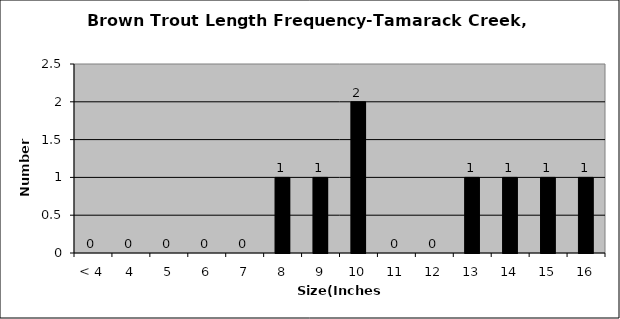
| Category | Series 0 |
|---|---|
| < 4 | 0 |
| 4 | 0 |
| 5 | 0 |
| 6 | 0 |
| 7 | 0 |
| 8 | 1 |
| 9 | 1 |
| 10 | 2 |
| 11 | 0 |
| 12 | 0 |
| 13 | 1 |
| 14 | 1 |
| 15 | 1 |
| 16 | 1 |